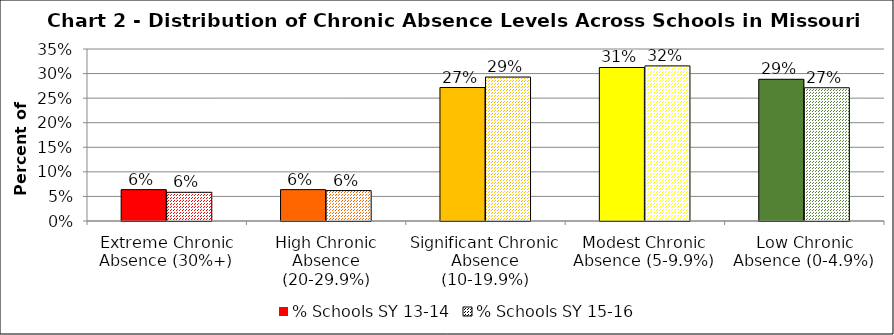
| Category | % Schools SY 13-14 | % Schools SY 15-16 |
|---|---|---|
| Extreme Chronic Absence (30%+) | 0.064 | 0.058 |
| High Chronic Absence (20-29.9%) | 0.064 | 0.062 |
| Significant Chronic Absence (10-19.9%) | 0.272 | 0.293 |
| Modest Chronic Absence (5-9.9%) | 0.312 | 0.316 |
| Low Chronic Absence (0-4.9%) | 0.288 | 0.271 |